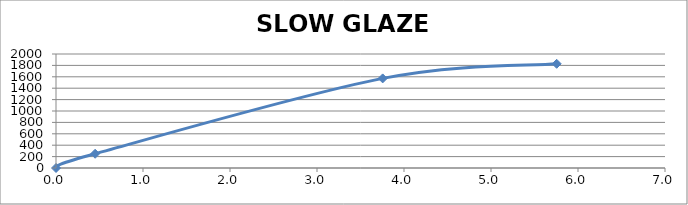
| Category | SLOW GLAZE CHART |
|---|---|
| 0.0 | 0 |
| 0.45 | 250 |
| 3.755 | 1572 |
| 5.755000000000001 | 1828 |